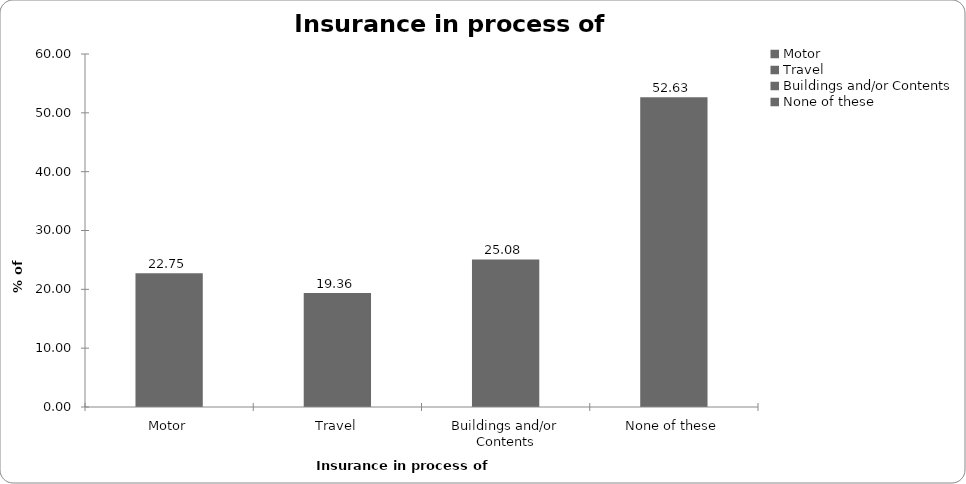
| Category | Insurance in process of buying |
|---|---|
| Motor | 22.754 |
| Travel | 19.361 |
| Buildings and/or Contents | 25.083 |
| None of these | 52.628 |